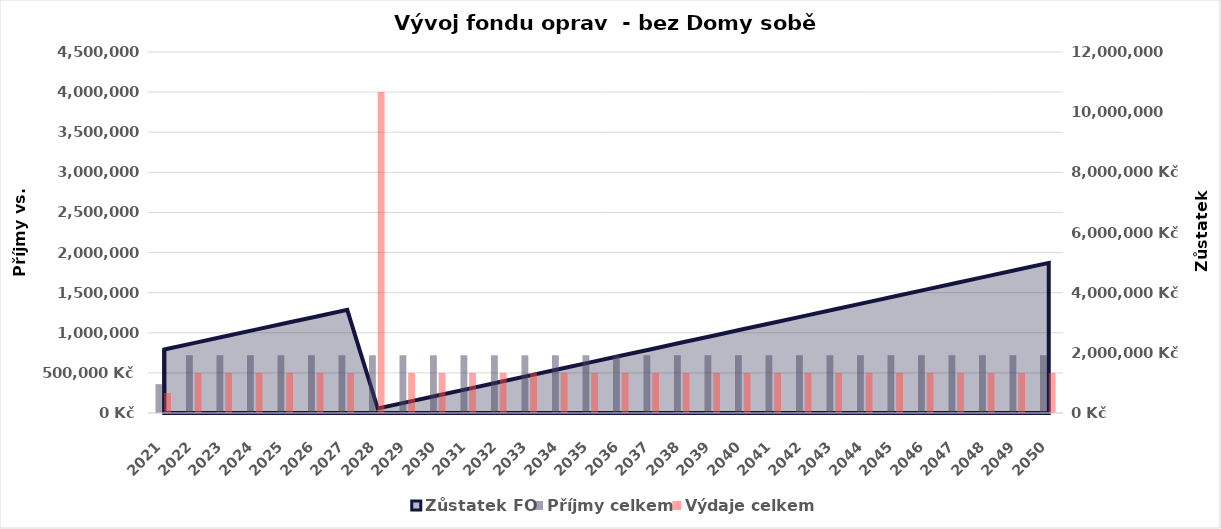
| Category | Příjmy celkem | Výdaje celkem |
|---|---|---|
| 2021.0 | 360000 | 250000 |
| 2022.0 | 720000 | 500000 |
| 2023.0 | 720000 | 500000 |
| 2024.0 | 720000 | 500000 |
| 2025.0 | 720000 | 500000 |
| 2026.0 | 720000 | 500000 |
| 2027.0 | 720000 | 500000 |
| 2028.0 | 720000 | 4000000 |
| 2029.0 | 720000 | 500000 |
| 2030.0 | 720000 | 500000 |
| 2031.0 | 720000 | 500000 |
| 2032.0 | 720000 | 500000 |
| 2033.0 | 720000 | 500000 |
| 2034.0 | 720000 | 500000 |
| 2035.0 | 720000 | 500000 |
| 2036.0 | 720000 | 500000 |
| 2037.0 | 720000 | 500000 |
| 2038.0 | 720000 | 500000 |
| 2039.0 | 720000 | 500000 |
| 2040.0 | 720000 | 500000 |
| 2041.0 | 720000 | 500000 |
| 2042.0 | 720000 | 500000 |
| 2043.0 | 720000 | 500000 |
| 2044.0 | 720000 | 500000 |
| 2045.0 | 720000 | 500000 |
| 2046.0 | 720000 | 500000 |
| 2047.0 | 720000 | 500000 |
| 2048.0 | 720000 | 500000 |
| 2049.0 | 720000 | 500000 |
| 2050.0 | 720000 | 500000 |